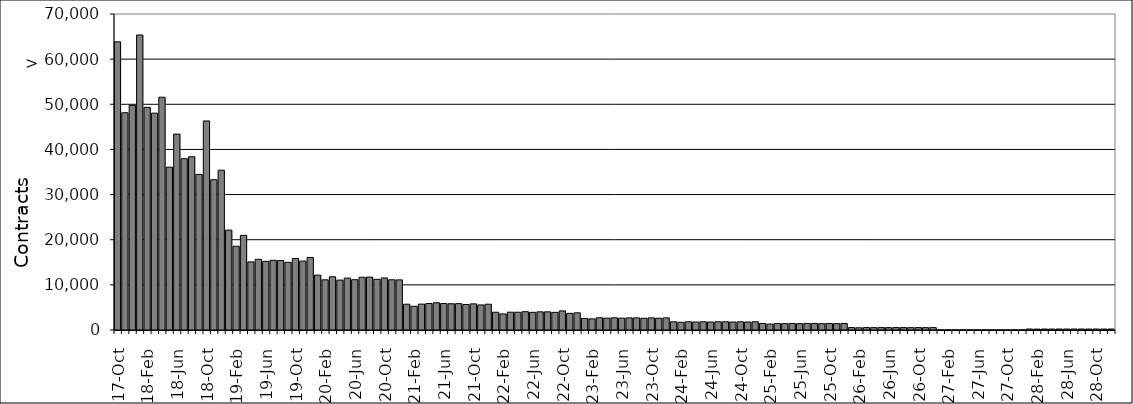
| Category | Series 0 |
|---|---|
| 17-Oct | 63833 |
| 17-Nov | 48124 |
| 17-Dec | 49764 |
| 18-Jan | 65354 |
| 18-Feb | 49317 |
| 18-Mar | 48035 |
| 18-Apr | 51560 |
| 18-May | 36067 |
| 18-Jun | 43392 |
| JLY18 | 37932 |
| 18-Aug | 38373 |
| 18-Sep | 34480 |
| 18-Oct | 46311 |
| 18-Nov | 33294 |
| 18-Dec | 35397 |
| 19-Jan | 22123 |
| 19-Feb | 18551 |
| 19-Mar | 20963 |
| 19-Apr | 15083 |
| 19-May | 15663 |
| 19-Jun | 15211 |
| JLY19 | 15435 |
| 19-Aug | 15377 |
| 19-Sep | 14983 |
| 19-Oct | 15835 |
| 19-Nov | 15259 |
| 19-Dec | 16072 |
| 20-Jan | 12154 |
| 20-Feb | 11119 |
| 20-Mar | 11790 |
| 20-Apr | 11052 |
| 20-May | 11498 |
| 20-Jun | 11145 |
| JLY20 | 11675 |
| 20-Aug | 11713 |
| 20-Sep | 11226 |
| 20-Oct | 11526 |
| 20-Nov | 11125 |
| 20-Dec | 11106 |
| 21-Jan | 5712 |
| 21-Feb | 5253 |
| 21-Mar | 5734 |
| 21-Apr | 5864 |
| 21-May | 6036 |
| 21-Jun | 5860 |
| JLY21 | 5814 |
| 21-Aug | 5842 |
| 21-Sep | 5649 |
| 21-Oct | 5788 |
| 21-Nov | 5549 |
| 21-Dec | 5716 |
| 22-Jan | 3935 |
| 22-Feb | 3556 |
| 22-Mar | 3943 |
| 22-Apr | 3938 |
| 22-May | 4053 |
| 22-Jun | 3912 |
| JLY22 | 4025 |
| 22-Aug | 4021 |
| 22-Sep | 3903 |
| 22-Oct | 4232 |
| 22-Nov | 3689 |
| 22-Dec | 3807 |
| 23-Jan | 2548 |
| 23-Feb | 2470 |
| 23-Mar | 2708 |
| 23-Apr | 2624 |
| 23-May | 2704 |
| 23-Jun | 2624 |
| JLY23 | 2680 |
| 23-Aug | 2680 |
| 23-Sep | 2596 |
| 23-Oct | 2680 |
| 23-Nov | 2604 |
| 23-Dec | 2684 |
| 24-Jan | 1823 |
| 24-Feb | 1709 |
| 24-Mar | 1823 |
| 24-Apr | 1766 |
| 24-May | 1823 |
| 24-Jun | 1766 |
| JLY24 | 1823 |
| 24-Aug | 1823 |
| 24-Sep | 1766 |
| 24-Oct | 1823 |
| 24-Nov | 1766 |
| 24-Dec | 1823 |
| 25-Jan | 1453 |
| 25-Feb | 1312 |
| 25-Mar | 1453 |
| 25-Apr | 1406 |
| 25-May | 1453 |
| 25-Jun | 1406 |
| JLY25 | 1453 |
| 25-Aug | 1453 |
| 25-Sep | 1406 |
| 25-Oct | 1453 |
| 25-Nov | 1406 |
| 25-Dec | 1453 |
| 26-Jan | 536 |
| 26-Feb | 488 |
| 26-Mar | 536 |
| 26-Apr | 520 |
| 26-May | 536 |
| 26-Jun | 520 |
| JLY26 | 536 |
| 26-Aug | 536 |
| 26-Sep | 520 |
| 26-Oct | 536 |
| 26-Nov | 520 |
| 26-Dec | 536 |
| 27-Jan | 20 |
| 27-Feb | 20 |
| 27-Mar | 20 |
| 27-Apr | 20 |
| 27-May | 20 |
| 27-Jun | 20 |
| JLY27 | 20 |
| 27-Aug | 20 |
| 27-Sep | 20 |
| 27-Oct | 20 |
| 27-Nov | 20 |
| 27-Dec | 20 |
| 28-Jan | 217 |
| 28-Feb | 203 |
| 28-Mar | 217 |
| 28-Apr | 210 |
| 28-May | 217 |
| 28-Jun | 210 |
| JLY28 | 217 |
| 28-Aug | 217 |
| 28-Sep | 210 |
| 28-Oct | 217 |
| 28-Nov | 210 |
| 28-Dec | 217 |